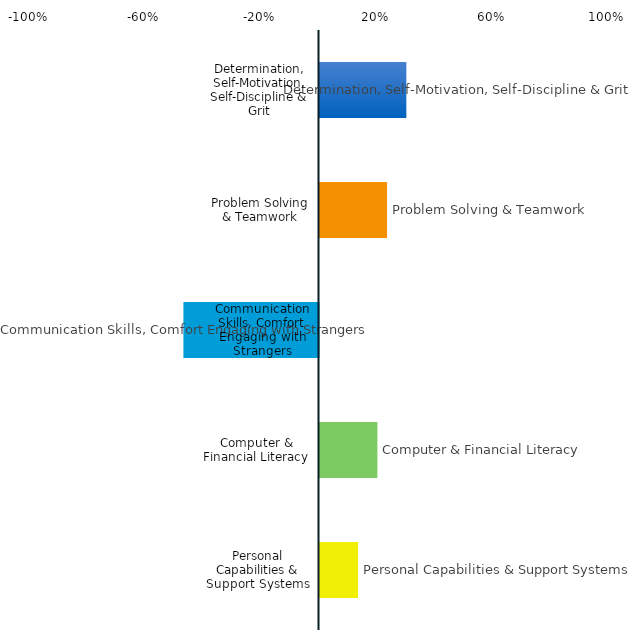
| Category | Series 0 |
|---|---|
| Determination, Self-Motivation, Self-Discipline & Grit | 0.3 |
| Problem Solving & Teamwork | 0.233 |
| Communication Skills, Comfort Engaging with Strangers | -0.467 |
| Computer & Financial Literacy | 0.2 |
| Personal Capabilities & Support Systems | 0.133 |